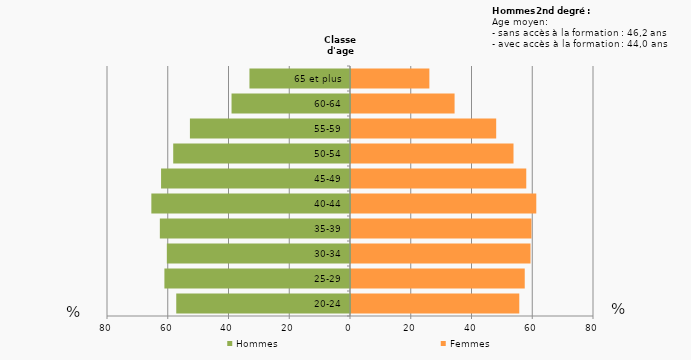
| Category | Femmes | Hommes |
|---|---|---|
| 20-24 | 55.4 | -57.2 |
| 25-29 | 57.2 | -61.1 |
| 30-34 | 59.1 | -60.3 |
| 35-39 | 59.4 | -62.6 |
| 40-44 | 61 | -65.4 |
| 45-49 | 57.7 | -62.2 |
| 50-54 | 53.5 | -58.2 |
| 55-59 | 47.8 | -52.7 |
| 60-64 | 34.1 | -39 |
| 65 et plus | 25.8 | -33.1 |